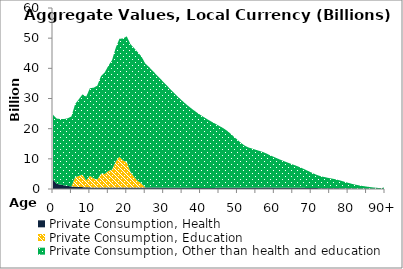
| Category | Private Consumption, Health | Private Consumption, Education | Private Consumption, Other than health and education |
|---|---|---|---|
| 0 | 3149.572 | 0 | 21469.235 |
|  | 1723.02 | 0 | 21629.946 |
| 2 | 1455.784 | 0 | 21737.111 |
| 3 | 1221.279 | 0 | 21966.803 |
| 4 | 1017.648 | 0 | 22435.698 |
| 5 | 866.094 | 0 | 23207.084 |
| 6 | 773.011 | 3128.077 | 24256.126 |
| 7 | 686.613 | 3645.623 | 25417.805 |
| 8 | 623.763 | 4138.215 | 26606.578 |
| 9 | 578.689 | 2245.255 | 27797.493 |
| 10 | 539.625 | 3879.054 | 28978.757 |
| 11 | 507.655 | 3036.437 | 30040.99 |
| 12 | 485.437 | 2603.086 | 31138.949 |
| 13 | 468.507 | 4585.868 | 32334.216 |
| 14 | 463.283 | 4542.351 | 33588.938 |
| 15 | 466.121 | 5491.834 | 34875.413 |
| 16 | 474.43 | 5940.371 | 36294.453 |
| 17 | 487.508 | 8581.435 | 37711.229 |
| 18 | 502.53 | 10153.356 | 39130.769 |
| 19 | 513.761 | 8922.658 | 40478.587 |
| 20 | 521.719 | 8474.418 | 41599.602 |
| 21 | 527.24 | 5136.836 | 42362.691 |
| 22 | 524.423 | 3453.436 | 42723.739 |
| 23 | 523.784 | 2145.16 | 42651.501 |
| 24 | 516.932 | 1306.009 | 42076.319 |
| 25 | 508.792 | 0 | 41096.986 |
| 26 | 497.157 | 0 | 39981.624 |
| 27 | 487.693 | 0 | 38734.325 |
| 28 | 468.707 | 0 | 37444.046 |
| 29 | 453.041 | 0 | 36201.504 |
| 30 | 436.334 | 0 | 34964.64 |
| 31 | 420.974 | 0 | 33695.055 |
| 32 | 408.359 | 0 | 32461.857 |
| 33 | 399.96 | 0 | 31224.522 |
| 34 | 392.685 | 0 | 30022.891 |
| 35 | 387.385 | 0 | 28904.995 |
| 36 | 382.263 | 0 | 27818.789 |
| 37 | 374.717 | 0 | 26818.195 |
| 38 | 369.788 | 0 | 25880.598 |
| 39 | 364.075 | 0 | 24998.746 |
| 40 | 359.243 | 0 | 24169.714 |
| 41 | 357.381 | 0 | 23385.389 |
| 42 | 359.502 | 0 | 22640.181 |
| 43 | 362.278 | 0 | 21941.011 |
| 44 | 373.249 | 0 | 21267.947 |
| 45 | 382.048 | 0 | 20570.514 |
| 46 | 391.735 | 0 | 19889.428 |
| 47 | 397.504 | 0 | 19079.109 |
| 48 | 401.785 | 0 | 18087.579 |
| 49 | 396.899 | 0 | 16987.276 |
| 50 | 394.23 | 0 | 15927.531 |
| 51 | 389.273 | 0 | 14858.486 |
| 52 | 387.845 | 0 | 13972.241 |
| 53 | 393.213 | 0 | 13377.266 |
| 54 | 410.988 | 0 | 12974.341 |
| 55 | 427.294 | 0 | 12560.122 |
| 56 | 442.617 | 0 | 12178.005 |
| 57 | 454.525 | 0 | 11756.519 |
| 58 | 459.935 | 0 | 11237.417 |
| 59 | 455.964 | 0 | 10652.726 |
| 60 | 453.435 | 0 | 10111.901 |
| 61 | 450.122 | 0 | 9587.774 |
| 62 | 445.258 | 0 | 9082.755 |
| 63 | 440.032 | 0 | 8607.376 |
| 64 | 432.723 | 0 | 8155.852 |
| 65 | 422.102 | 0 | 7701.667 |
| 66 | 411.533 | 0 | 7266.82 |
| 67 | 397.388 | 0 | 6795.568 |
| 68 | 377.937 | 0 | 6265.722 |
| 69 | 354.804 | 0 | 5706.785 |
| 70 | 331.369 | 0 | 5168.165 |
| 71 | 305.858 | 0 | 4630.229 |
| 72 | 284.027 | 0 | 4174.801 |
| 73 | 269.025 | 0 | 3838.783 |
| 74 | 258.532 | 0 | 3591.043 |
| 75 | 247.326 | 0 | 3347.131 |
| 76 | 237.013 | 0 | 3127.939 |
| 77 | 223.549 | 0 | 2878.518 |
| 78 | 204.157 | 0 | 2567.259 |
| 79 | 180.879 | 0 | 2215.084 |
| 80 | 158.652 | 0 | 1891.858 |
| 81 | 136.558 | 0 | 1584.303 |
| 82 | 116.196 | 0 | 1310.955 |
| 83 | 99.093 | 0 | 1086.82 |
| 84 | 84.541 | 0 | 902.59 |
| 85 | 70.25 | 0 | 730.348 |
| 86 | 56.608 | 0 | 573.305 |
| 87 | 44.666 | 0 | 440.833 |
| 88 | 34.721 | 0 | 334.071 |
| 89 | 26.55 | 0 | 249.121 |
| 90+ | 55.82 | 0 | 510.94 |